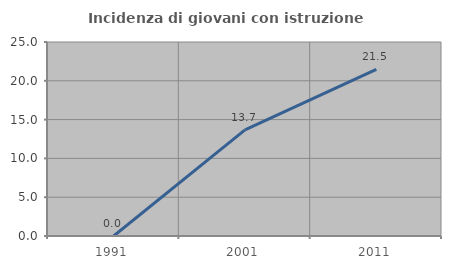
| Category | Incidenza di giovani con istruzione universitaria |
|---|---|
| 1991.0 | 0 |
| 2001.0 | 13.684 |
| 2011.0 | 21.463 |